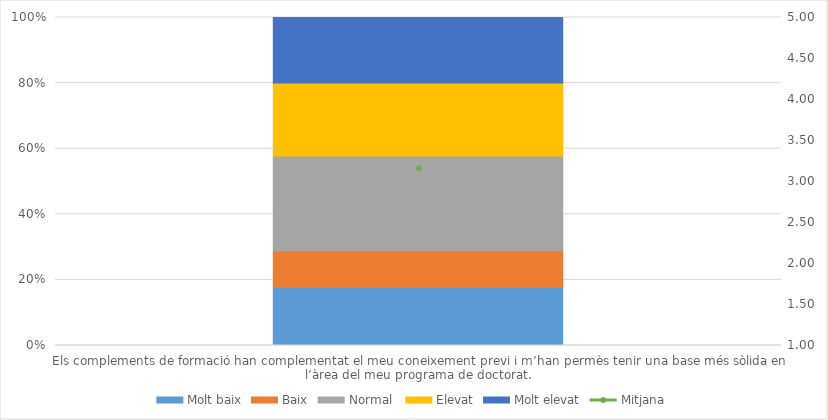
| Category | Molt baix | Baix | Normal  | Elevat | Molt elevat |
|---|---|---|---|---|---|
| Els complements de formació han complementat el meu coneixement previ i m’han permès tenir una base més sòlida en l’àrea del meu programa de doctorat. | 8 | 5 | 13 | 10 | 9 |